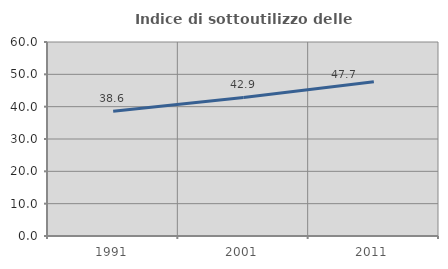
| Category | Indice di sottoutilizzo delle abitazioni  |
|---|---|
| 1991.0 | 38.571 |
| 2001.0 | 42.857 |
| 2011.0 | 47.741 |